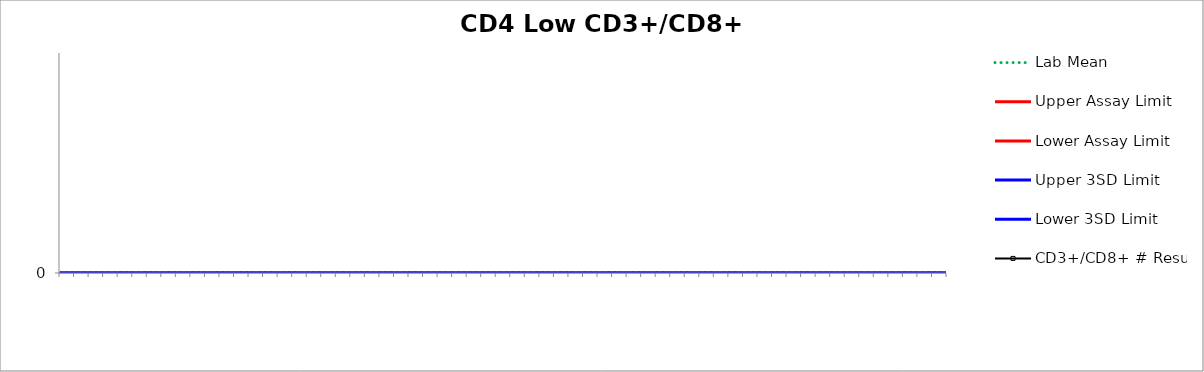
| Category | Lab Mean | Upper Assay Limit | Lower Assay Limit | Upper 3SD Limit | Lower 3SD Limit | CD3+/CD8+ # Result |
|---|---|---|---|---|---|---|
|  | 0 |  |  | 0 | 0 |  |
|  | 0 |  |  | 0 | 0 |  |
|  | 0 |  |  | 0 | 0 |  |
|  | 0 |  |  | 0 | 0 |  |
|  | 0 |  |  | 0 | 0 |  |
|  | 0 |  |  | 0 | 0 |  |
|  | 0 |  |  | 0 | 0 |  |
|  | 0 |  |  | 0 | 0 |  |
|  | 0 |  |  | 0 | 0 |  |
|  | 0 |  |  | 0 | 0 |  |
|  | 0 |  |  | 0 | 0 |  |
|  | 0 |  |  | 0 | 0 |  |
|  | 0 |  |  | 0 | 0 |  |
|  | 0 |  |  | 0 | 0 |  |
|  | 0 |  |  | 0 | 0 |  |
|  | 0 |  |  | 0 | 0 |  |
|  | 0 |  |  | 0 | 0 |  |
|  | 0 |  |  | 0 | 0 |  |
|  | 0 |  |  | 0 | 0 |  |
|  | 0 |  |  | 0 | 0 |  |
|  | 0 |  |  | 0 | 0 |  |
|  | 0 |  |  | 0 | 0 |  |
|  | 0 |  |  | 0 | 0 |  |
|  | 0 |  |  | 0 | 0 |  |
|  | 0 |  |  | 0 | 0 |  |
|  | 0 |  |  | 0 | 0 |  |
|  | 0 |  |  | 0 | 0 |  |
|  | 0 |  |  | 0 | 0 |  |
|  | 0 |  |  | 0 | 0 |  |
|  | 0 |  |  | 0 | 0 |  |
|  | 0 |  |  | 0 | 0 |  |
|  | 0 |  |  | 0 | 0 |  |
|  | 0 |  |  | 0 | 0 |  |
|  | 0 |  |  | 0 | 0 |  |
|  | 0 |  |  | 0 | 0 |  |
|  | 0 |  |  | 0 | 0 |  |
|  | 0 |  |  | 0 | 0 |  |
|  | 0 |  |  | 0 | 0 |  |
|  | 0 |  |  | 0 | 0 |  |
|  | 0 |  |  | 0 | 0 |  |
|  | 0 |  |  | 0 | 0 |  |
|  | 0 |  |  | 0 | 0 |  |
|  | 0 |  |  | 0 | 0 |  |
|  | 0 |  |  | 0 | 0 |  |
|  | 0 |  |  | 0 | 0 |  |
|  | 0 |  |  | 0 | 0 |  |
|  | 0 |  |  | 0 | 0 |  |
|  | 0 |  |  | 0 | 0 |  |
|  | 0 |  |  | 0 | 0 |  |
|  | 0 |  |  | 0 | 0 |  |
|  | 0 |  |  | 0 | 0 |  |
|  | 0 |  |  | 0 | 0 |  |
|  | 0 |  |  | 0 | 0 |  |
|  | 0 |  |  | 0 | 0 |  |
|  | 0 |  |  | 0 | 0 |  |
|  | 0 |  |  | 0 | 0 |  |
|  | 0 |  |  | 0 | 0 |  |
|  | 0 |  |  | 0 | 0 |  |
|  | 0 |  |  | 0 | 0 |  |
|  | 0 |  |  | 0 | 0 |  |
|  | 0 |  |  | 0 | 0 |  |
|  | 0 |  |  | 0 | 0 |  |